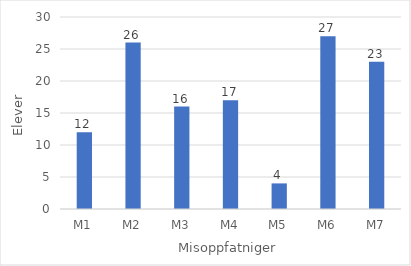
| Category | Series 0 |
|---|---|
| M1 | 12 |
| M2 | 26 |
| M3 | 16 |
| M4 | 17 |
| M5 | 4 |
| M6 | 27 |
| M7 | 23 |